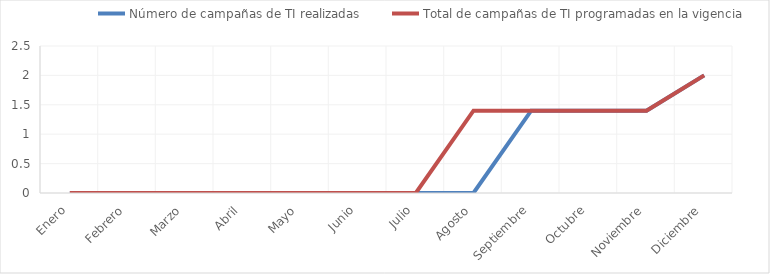
| Category | Número de campañas de TI realizadas  | Total de campañas de TI programadas en la vigencia |
|---|---|---|
| 0 | 0 | 0 |
| 1 | 0 | 0 |
| 2 | 0 | 0 |
| 3 | 0 | 0 |
| 4 | 0 | 0 |
| 5 | 0 | 0 |
| 6 | 0 | 0 |
| 7 | 0 | 1.4 |
| 8 | 1.4 | 1.4 |
| 9 | 1.4 | 1.4 |
| 10 | 1.4 | 1.4 |
| 11 | 2 | 2 |